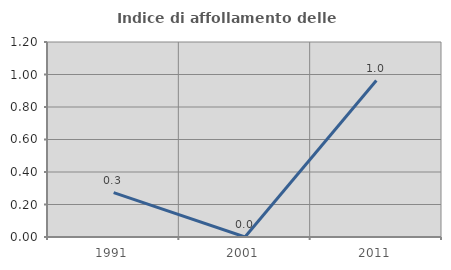
| Category | Indice di affollamento delle abitazioni  |
|---|---|
| 1991.0 | 0.273 |
| 2001.0 | 0 |
| 2011.0 | 0.963 |